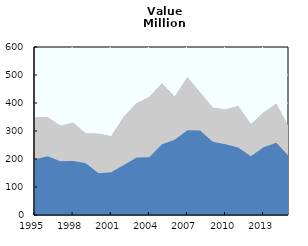
| Category | Marine landings + Aquaculture + Inland fisheries | Marine landings + Aquaculture | Marine landings |
|---|---|---|---|
| 1995.0 | 348.427 | 348.427 | 199.091 |
| 1996.0 | 348.979 | 348.979 | 210.145 |
| 1997.0 | 319.051 | 319.051 | 192.29 |
| 1998.0 | 329.317 | 329.317 | 193.222 |
| 1999.0 | 291.298 | 291.298 | 185.14 |
| 2000.0 | 290.55 | 290.55 | 149.172 |
| 2001.0 | 281.639 | 281.639 | 152.727 |
| 2002.0 | 350.635 | 350.635 | 178.938 |
| 2003.0 | 399.054 | 399.054 | 205.687 |
| 2004.0 | 421.744 | 421.744 | 205.879 |
| 2005.0 | 469.454 | 469.454 | 252.957 |
| 2006.0 | 422.372 | 422.372 | 268.442 |
| 2007.0 | 491.524 | 491.524 | 302.285 |
| 2008.0 | 437.355 | 437.355 | 301.901 |
| 2009.0 | 382.81 | 382.81 | 261.543 |
| 2010.0 | 376.617 | 376.617 | 253.113 |
| 2011.0 | 388.864 | 388.864 | 240.739 |
| 2012.0 | 323.824 | 323.824 | 210.104 |
| 2013.0 | 365.782 | 365.782 | 242.397 |
| 2014.0 | 397.162 | 397.162 | 258.299 |
| 2015.0 | 311.869 | 311.869 | 209.128 |